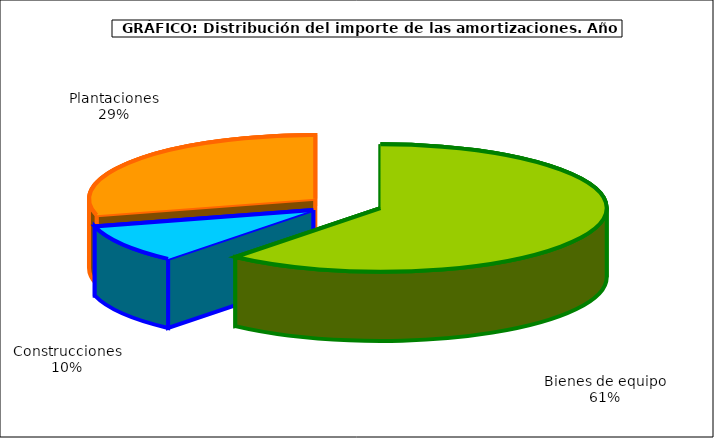
| Category | Series 0 |
|---|---|
| Bienes de equipo | 3692.893 |
| Construcciones | 590.126 |
| Plantaciones | 1761.659 |